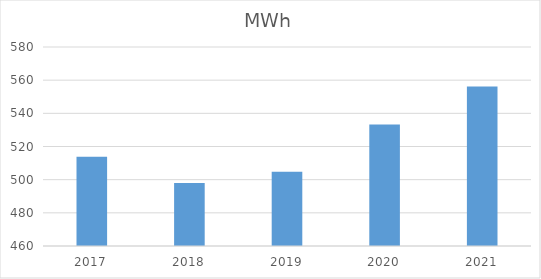
| Category | MWh |
|---|---|
| 2017.0 | 513.756 |
| 2018.0 | 497.946 |
| 2019.0 | 504.735 |
| 2020.0 | 533.335 |
| 2021.0 | 556.174 |